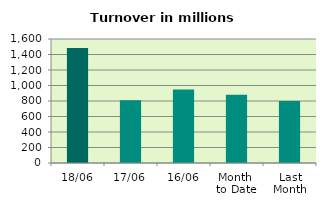
| Category | Series 0 |
|---|---|
| 18/06 | 1482.642 |
| 17/06 | 810.911 |
| 16/06 | 948.091 |
| Month 
to Date | 879.664 |
| Last
Month | 798.504 |